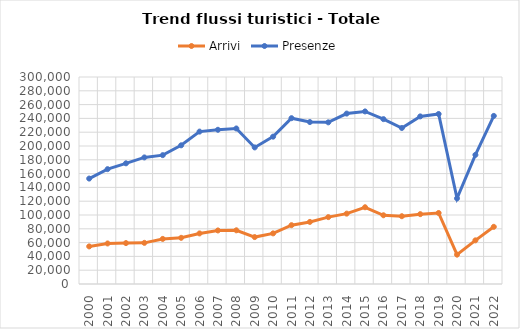
| Category | Arrivi | Presenze |
|---|---|---|
| 2000.0 | 54471 | 152814 |
| 2001.0 | 58743 | 166453 |
| 2002.0 | 59292 | 174899 |
| 2003.0 | 59634 | 183440 |
| 2004.0 | 65348 | 186747 |
| 2005.0 | 66922 | 200996 |
| 2006.0 | 73297 | 220862 |
| 2007.0 | 77613 | 223496 |
| 2008.0 | 77816 | 225395 |
| 2009.0 | 68007 | 197940 |
| 2010.0 | 73372 | 213550 |
| 2011.0 | 85256 | 240311 |
| 2012.0 | 89980 | 234719 |
| 2013.0 | 96941 | 234280 |
| 2014.0 | 101977 | 246987 |
| 2015.0 | 111229 | 250109 |
| 2016.0 | 99619 | 238955 |
| 2017.0 | 98246 | 226109 |
| 2018.0 | 101232 | 242890 |
| 2019.0 | 102921 | 246387 |
| 2020.0 | 42531 | 124136 |
| 2021.0 | 63253 | 187151 |
| 2022.0 | 82874 | 243619 |